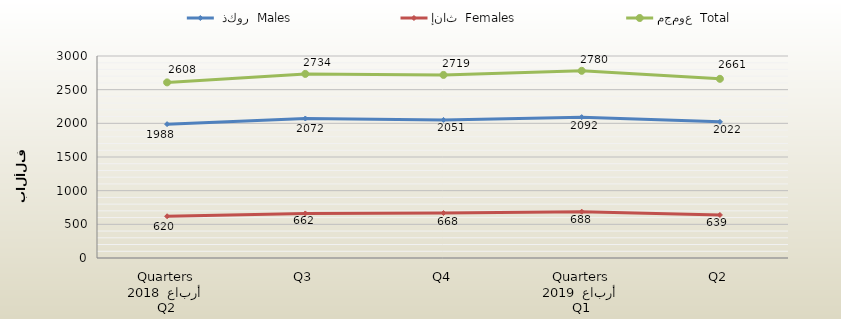
| Category |  ذكور  Males | إناث  Females | مجموع  Total |
|---|---|---|---|
| 0 | 1988 | 620 | 2608 |
| 1 | 2072 | 662 | 2734 |
| 2 | 2051 | 668 | 2719 |
| 3 | 2092 | 688 | 2780 |
| 4 | 2022 | 639 | 2661 |